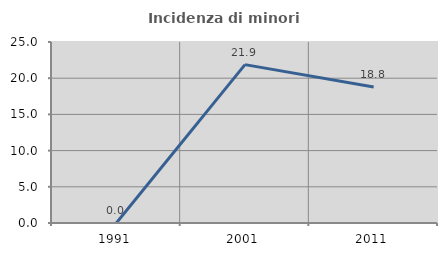
| Category | Incidenza di minori stranieri |
|---|---|
| 1991.0 | 0 |
| 2001.0 | 21.875 |
| 2011.0 | 18.788 |